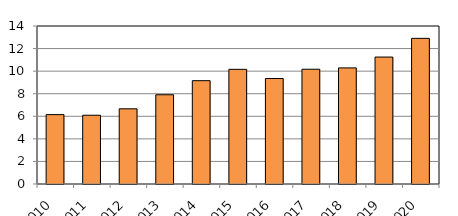
| Category | Series 1 |
|---|---|
| 2010 | 6148 |
| 2011 | 6092 |
| 2012 | 6663 |
| 2013 | 7908 |
| 2014 | 9155 |
| 2015 | 10160 |
| 2016 | 9348 |
| 2017 | 10170 |
| 2018 | 10287 |
| 2019 | 11249 |
| 2020 | 12905 |